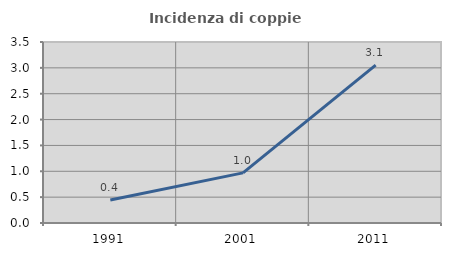
| Category | Incidenza di coppie miste |
|---|---|
| 1991.0 | 0.443 |
| 2001.0 | 0.969 |
| 2011.0 | 3.052 |